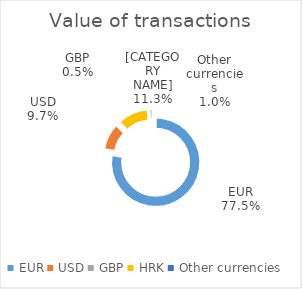
| Category | Value of transactions |
|---|---|
| EUR | 209573633929 |
| USD | 26330847020 |
| GBP | 1285542636 |
| HRK | 30371841332 |
| Other currencies | 2698251200 |